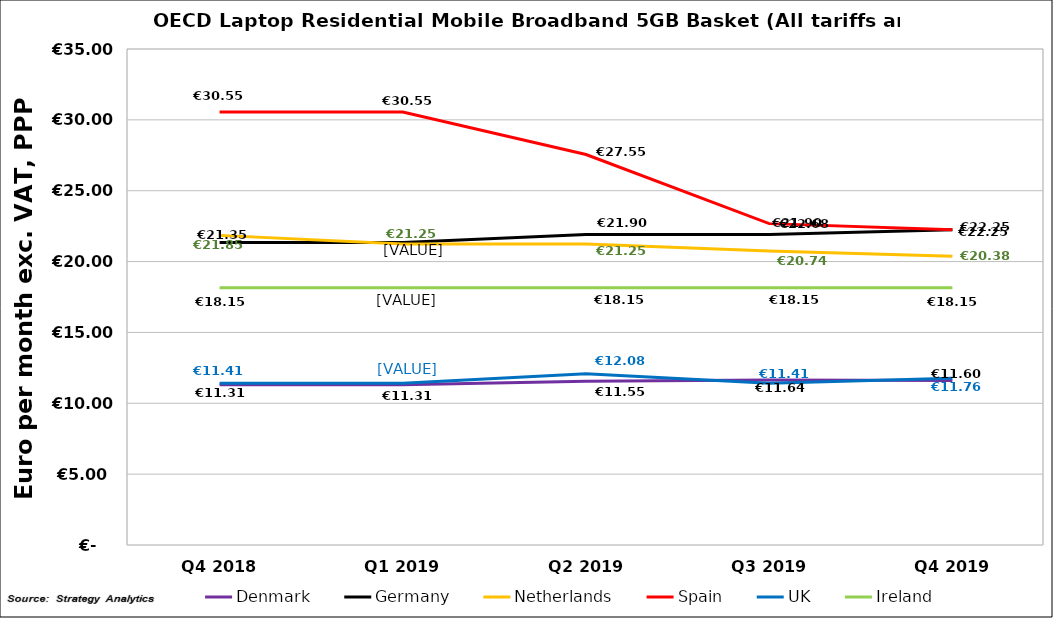
| Category | Denmark | Germany | Netherlands | Spain | UK | Ireland |
|---|---|---|---|---|---|---|
| Q4 2018 | 11.309 | 21.35 | 21.848 | 30.551 | 11.411 | 18.152 |
| Q1 2019 | 11.309 | 21.35 | 21.248 | 30.551 | 11.411 | 18.152 |
| Q2 2019 | 11.549 | 21.902 | 21.248 | 27.551 | 12.083 | 18.152 |
| Q3 2019 | 11.637 | 21.902 | 20.744 | 22.678 | 11.411 | 18.152 |
| Q4 2019 | 11.6 | 22.25 | 20.38 | 22.25 | 11.76 | 18.15 |